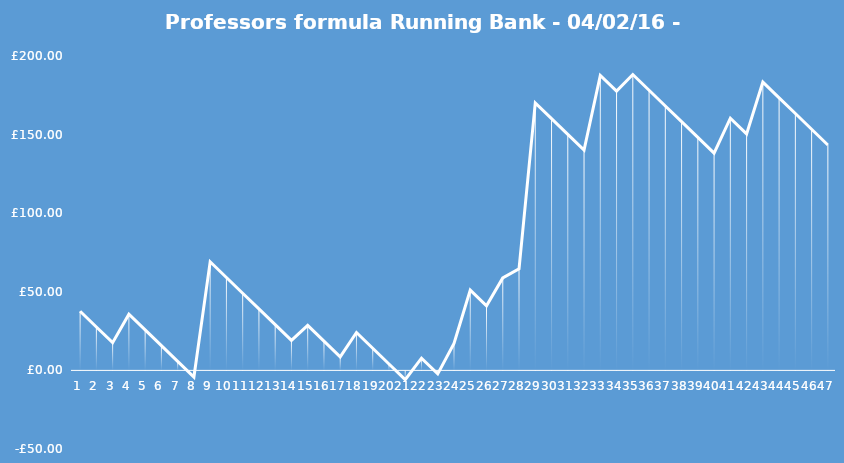
| Category | Running Bank |
|---|---|
| 0 | 37.62 |
| 1 | 27.62 |
| 2 | 17.62 |
| 3 | 35.765 |
| 4 | 25.765 |
| 5 | 15.765 |
| 6 | 5.765 |
| 7 | -4.235 |
| 8 | 69.105 |
| 9 | 59.105 |
| 10 | 49.105 |
| 11 | 39.105 |
| 12 | 29.105 |
| 13 | 19.105 |
| 14 | 28.605 |
| 15 | 18.605 |
| 16 | 8.605 |
| 17 | 24.09 |
| 18 | 14.09 |
| 19 | 4.09 |
| 20 | -5.91 |
| 21 | 7.77 |
| 22 | -2.23 |
| 23 | 17.15 |
| 24 | 51.065 |
| 25 | 41.065 |
| 26 | 58.83 |
| 27 | 64.625 |
| 28 | 170.17 |
| 29 | 160.17 |
| 30 | 150.17 |
| 31 | 140.17 |
| 32 | 187.67 |
| 33 | 177.67 |
| 34 | 188.215 |
| 35 | 178.215 |
| 36 | 168.215 |
| 37 | 158.215 |
| 38 | 148.215 |
| 39 | 138.215 |
| 40 | 160.445 |
| 41 | 150.445 |
| 42 | 183.41 |
| 43 | 173.41 |
| 44 | 163.41 |
| 45 | 153.41 |
| 46 | 143.41 |